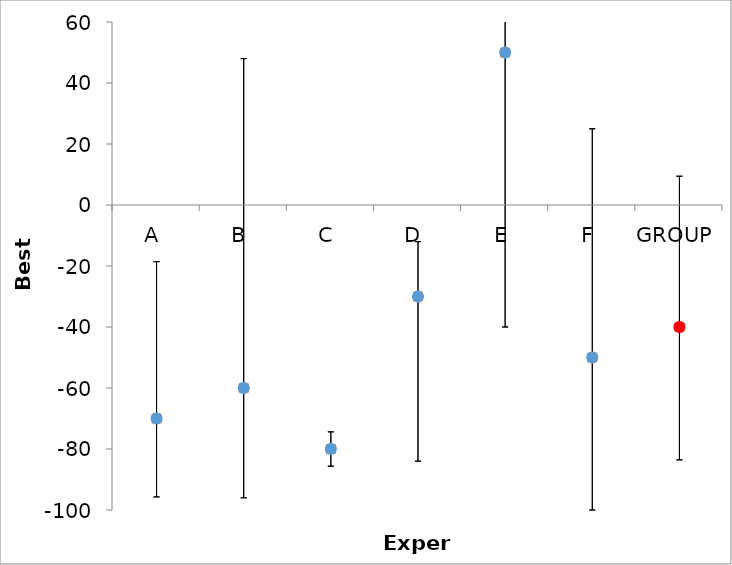
| Category | Series 1 | Series 0 |
|---|---|---|
| A | -70 | -70 |
| B | -60 | -60 |
| C | -80 | -80 |
| D | -30 | -30 |
| E | 50 | 50 |
| F | -50 | -50 |
| GROUP | -40 | -40 |